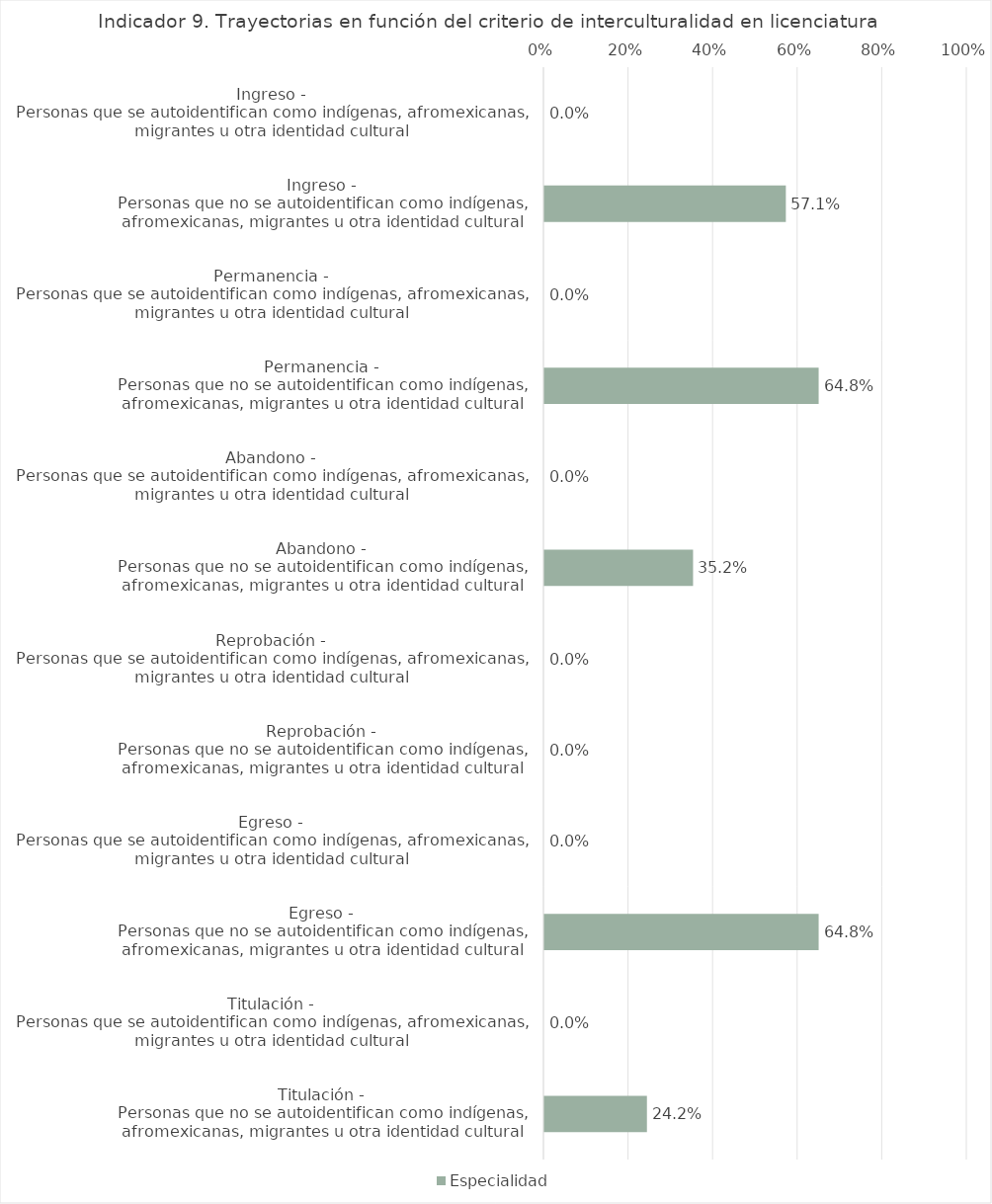
| Category | Especialidad |
|---|---|
| Ingreso - 
Personas que se autoidentifican como indígenas, afromexicanas, migrantes u otra identidad cultural | 0 |
| Ingreso - 
Personas que no se autoidentifican como indígenas, afromexicanas, migrantes u otra identidad cultural | 0.571 |
| Permanencia - 
Personas que se autoidentifican como indígenas, afromexicanas, migrantes u otra identidad cultural | 0 |
| Permanencia - 
Personas que no se autoidentifican como indígenas, afromexicanas, migrantes u otra identidad cultural | 0.648 |
| Abandono - 
Personas que se autoidentifican como indígenas, afromexicanas, migrantes u otra identidad cultural | 0 |
| Abandono - 
Personas que no se autoidentifican como indígenas, afromexicanas, migrantes u otra identidad cultural | 0.352 |
| Reprobación - 
Personas que se autoidentifican como indígenas, afromexicanas, migrantes u otra identidad cultural | 0 |
| Reprobación - 
Personas que no se autoidentifican como indígenas, afromexicanas, migrantes u otra identidad cultural | 0 |
| Egreso - 
Personas que se autoidentifican como indígenas, afromexicanas, migrantes u otra identidad cultural | 0 |
| Egreso - 
Personas que no se autoidentifican como indígenas, afromexicanas, migrantes u otra identidad cultural | 0.648 |
| Titulación - 
Personas que se autoidentifican como indígenas, afromexicanas, migrantes u otra identidad cultural | 0 |
| Titulación - 
Personas que no se autoidentifican como indígenas, afromexicanas, migrantes u otra identidad cultural | 0.242 |